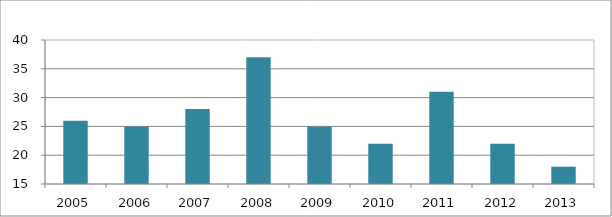
| Category | Series 1 |
|---|---|
| 2005.0 | 26 |
| 2006.0 | 25 |
| 2007.0 | 28 |
| 2008.0 | 37 |
| 2009.0 | 25 |
| 2010.0 | 22 |
| 2011.0 | 31 |
| 2012.0 | 22 |
| 2013.0 | 18 |